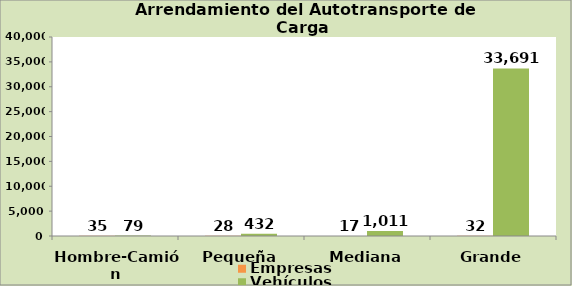
| Category | Empresas | Vehículos |
|---|---|---|
| Hombre-Camión | 35 | 79 |
| Pequeña | 28 | 432 |
| Mediana | 17 | 1011 |
| Grande | 32 | 33691 |